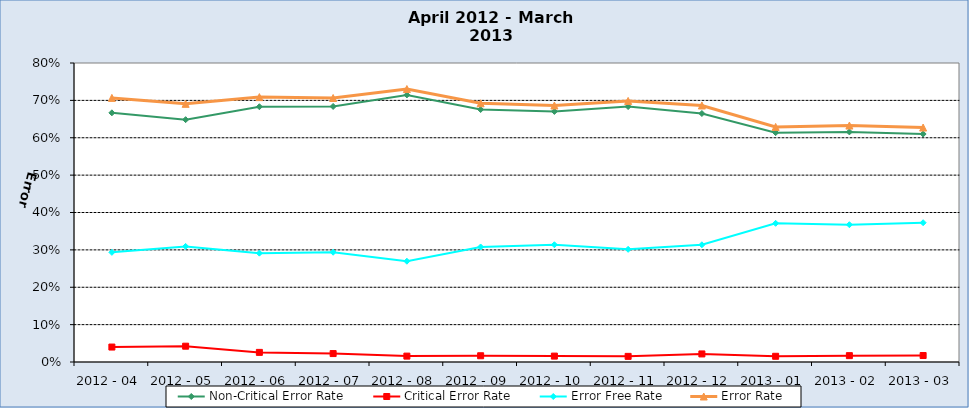
| Category | Non-Critical Error Rate | Critical Error Rate | Error Free Rate | Error Rate |
|---|---|---|---|---|
| 2012 - 04 | 0.667 | 0.04 | 0.293 | 0.707 |
| 2012 - 05 | 0.648 | 0.042 | 0.309 | 0.691 |
| 2012 - 06 | 0.683 | 0.026 | 0.291 | 0.709 |
| 2012 - 07 | 0.684 | 0.023 | 0.294 | 0.706 |
| 2012 - 08 | 0.715 | 0.016 | 0.27 | 0.73 |
| 2012 - 09 | 0.676 | 0.017 | 0.308 | 0.692 |
| 2012 - 10 | 0.67 | 0.016 | 0.314 | 0.686 |
| 2012 - 11 | 0.683 | 0.015 | 0.301 | 0.699 |
| 2012 - 12 | 0.665 | 0.022 | 0.314 | 0.686 |
| 2013 - 01 | 0.614 | 0.015 | 0.371 | 0.629 |
| 2013 - 02 | 0.616 | 0.017 | 0.367 | 0.633 |
| 2013 - 03 | 0.61 | 0.017 | 0.373 | 0.627 |